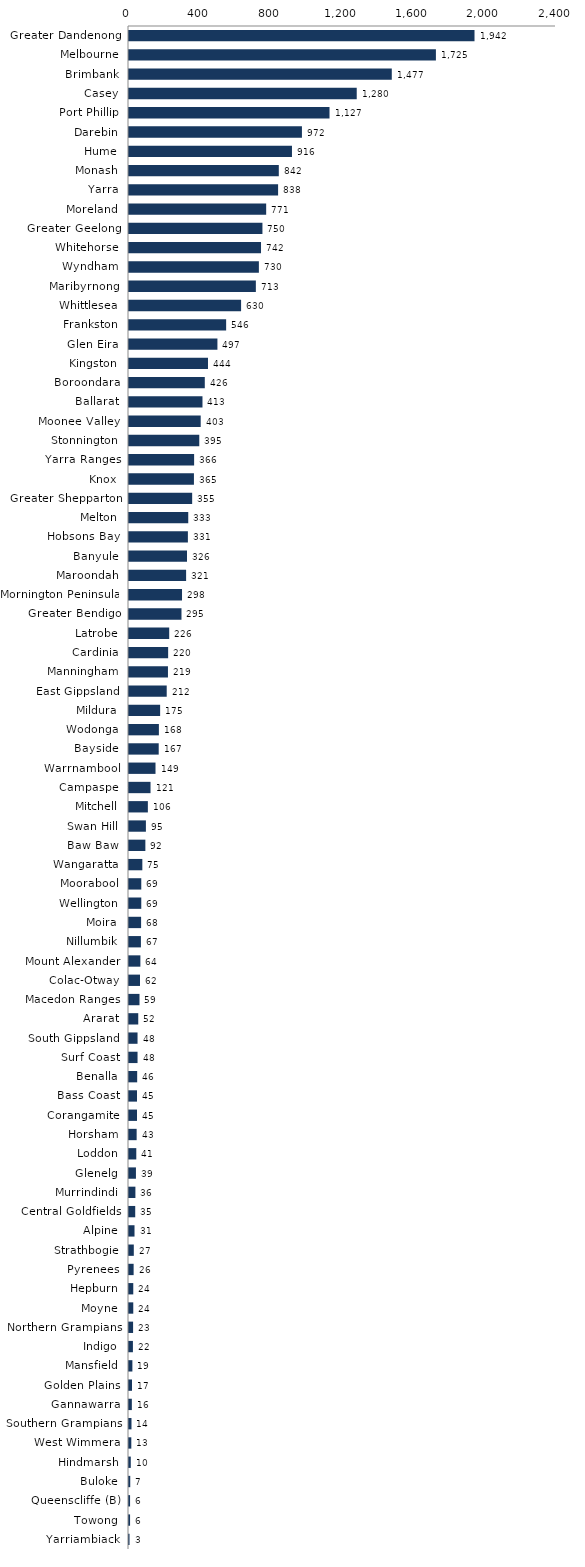
| Category | Series 0 |
|---|---|
| Greater Dandenong | 1942 |
| Melbourne | 1725 |
| Brimbank | 1477 |
| Casey | 1280 |
| Port Phillip | 1127 |
| Darebin | 972 |
| Hume | 916 |
| Monash | 842 |
| Yarra | 838 |
| Moreland | 771 |
| Greater Geelong | 750 |
| Whitehorse | 742 |
| Wyndham | 730 |
| Maribyrnong | 713 |
| Whittlesea | 630 |
| Frankston | 546 |
| Glen Eira | 497 |
| Kingston | 444 |
| Boroondara | 426 |
| Ballarat | 413 |
| Moonee Valley | 403 |
| Stonnington | 395 |
| Yarra Ranges | 366 |
| Knox | 365 |
| Greater Shepparton | 355 |
| Melton | 333 |
| Hobsons Bay | 331 |
| Banyule | 326 |
| Maroondah | 321 |
| Mornington Peninsula | 298 |
| Greater Bendigo | 295 |
| Latrobe | 226 |
| Cardinia | 220 |
| Manningham | 219 |
| East Gippsland | 212 |
| Mildura | 175 |
| Wodonga | 168 |
| Bayside | 167 |
| Warrnambool | 149 |
| Campaspe | 121 |
| Mitchell | 106 |
| Swan Hill | 95 |
| Baw Baw | 92 |
| Wangaratta | 75 |
| Moorabool | 69 |
| Wellington | 69 |
| Moira | 68 |
| Nillumbik | 67 |
| Mount Alexander | 64 |
| Colac-Otway | 62 |
| Macedon Ranges | 59 |
| Ararat | 52 |
| South Gippsland | 48 |
| Surf Coast | 48 |
| Benalla | 46 |
| Bass Coast | 45 |
| Corangamite | 45 |
| Horsham | 43 |
| Loddon | 41 |
| Glenelg | 39 |
| Murrindindi | 36 |
| Central Goldfields | 35 |
| Alpine | 31 |
| Strathbogie | 27 |
| Pyrenees | 26 |
| Hepburn | 24 |
| Moyne | 24 |
| Northern Grampians | 23 |
| Indigo | 22 |
| Mansfield | 19 |
| Golden Plains | 17 |
| Gannawarra | 16 |
| Southern Grampians | 14 |
| West Wimmera | 13 |
| Hindmarsh | 10 |
| Buloke | 7 |
| Queenscliffe (B) | 6 |
| Towong | 6 |
| Yarriambiack | 3 |